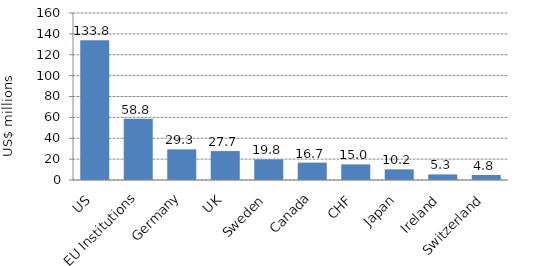
| Category | Series 0 |
|---|---|
| US | 133.809 |
| EU Institutions | 58.789 |
| Germany | 29.341 |
| UK | 27.704 |
| Sweden | 19.788 |
| Canada | 16.67 |
| CHF | 14.979 |
| Japan | 10.2 |
| Ireland | 5.332 |
| Switzerland | 4.788 |